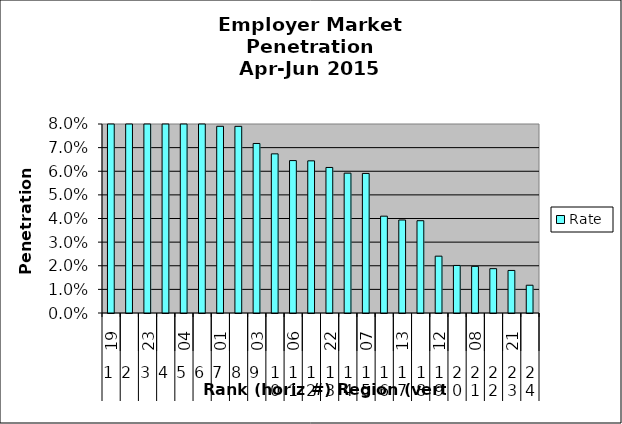
| Category | Rate |
|---|---|
| 0 | 0.119 |
| 1 | 0.101 |
| 2 | 0.097 |
| 3 | 0.093 |
| 4 | 0.084 |
| 5 | 0.08 |
| 6 | 0.079 |
| 7 | 0.079 |
| 8 | 0.072 |
| 9 | 0.067 |
| 10 | 0.065 |
| 11 | 0.064 |
| 12 | 0.062 |
| 13 | 0.059 |
| 14 | 0.059 |
| 15 | 0.041 |
| 16 | 0.039 |
| 17 | 0.039 |
| 18 | 0.024 |
| 19 | 0.02 |
| 20 | 0.02 |
| 21 | 0.019 |
| 22 | 0.018 |
| 23 | 0.012 |